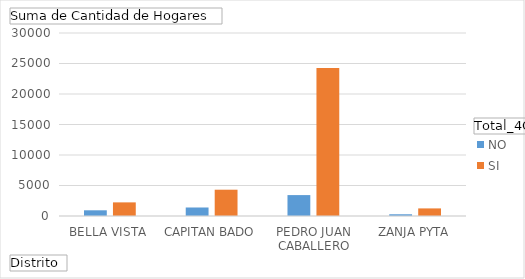
| Category | NO | SI |
|---|---|---|
| BELLA VISTA | 935 | 2234 |
| CAPITAN BADO | 1395 | 4310 |
| PEDRO JUAN CABALLERO | 3428 | 24249 |
| ZANJA PYTA | 283 | 1245 |